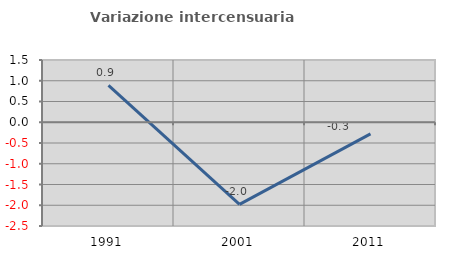
| Category | Variazione intercensuaria annua |
|---|---|
| 1991.0 | 0.889 |
| 2001.0 | -1.98 |
| 2011.0 | -0.281 |